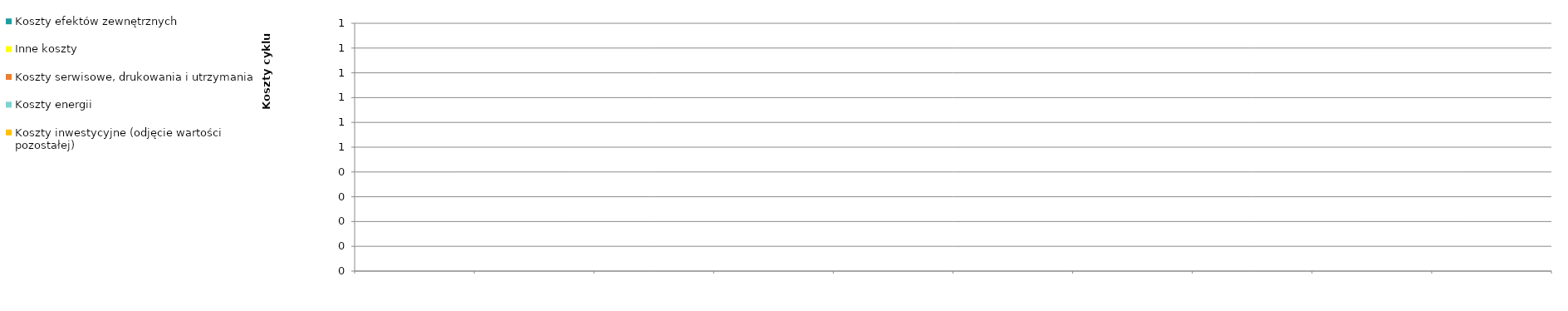
| Category | Koszty inwestycyjne (odjęcie wartości pozostałej) | Koszty energii | Koszty serwisowe, drukowania i utrzymania | Inne koszty | Koszty efektów zewnętrznych |
|---|---|---|---|---|---|
| 0 | 0 | 0 | 0 | 0 | 0 |
| 1 | 0 | 0 | 0 | 0 | 0 |
| 2 | 0 | 0 | 0 | 0 | 0 |
| 3 | 0 | 0 | 0 | 0 | 0 |
| 4 | 0 | 0 | 0 | 0 | 0 |
| 5 | 0 | 0 | 0 | 0 | 0 |
| 6 | 0 | 0 | 0 | 0 | 0 |
| 7 | 0 | 0 | 0 | 0 | 0 |
| 8 | 0 | 0 | 0 | 0 | 0 |
| 9 | 0 | 0 | 0 | 0 | 0 |